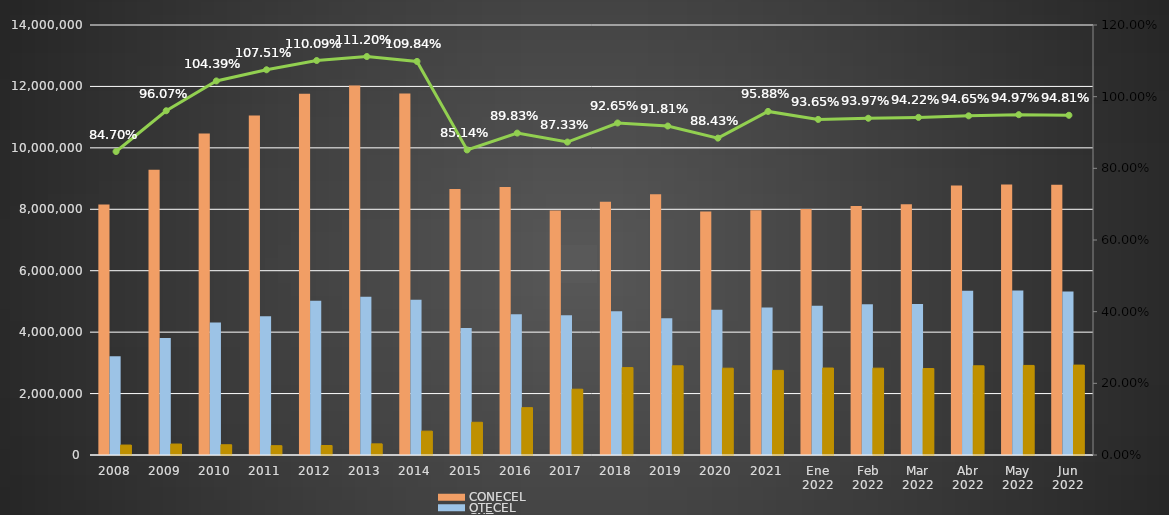
| Category | CONECEL | OTECEL | CNT |
|---|---|---|---|
| 2008 | 8156359 | 3211922 | 323967 |
| 2009 | 9291268 | 3806432 | 356900 |
| 2010 | 10470502 | 4314599 | 333730 |
| 2011 | 11057316 | 4513874 | 303368 |
| 2012 | 11757906 | 5019686 | 309271 |
| 2013 | 12030886 | 5148308 | 362560 |
| 2014 | 11772020 | 5055645 | 776892 |
| 2015 | 8658619 | 4134698 | 1065703 |
| 2016 | 8726823 | 4580092 | 1541219 |
| 2017 | 7960263 | 4549024 | 2142117 |
| 2018 | 8248050 | 4679646 | 2845142 |
| 2019 | 8493054 | 4456356 | 2903690 |
| 2020 | 7929253 | 4729725 | 2826388 |
| 2021 | 7965274 | 4800608 | 2755177 |
| Ene 2022 | 8012894 | 4856877 | 2831764 |
| Feb 2022 | 8103873 | 4909433 | 2827246 |
| Mar 2022 | 8163884 | 4915830 | 2814894 |
| Abr 2022 | 8773356 | 5349789 | 2904652 |
| May 2022 | 8810418 | 5358332 | 2916052 |
| Jun 2022 | 8802391 | 5326606 | 2926942 |